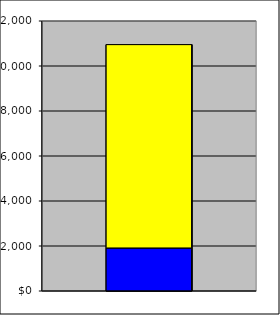
| Category | Series 0 | Series 1 |
|---|---|---|
| 0 | 1913.582 | 9036.378 |